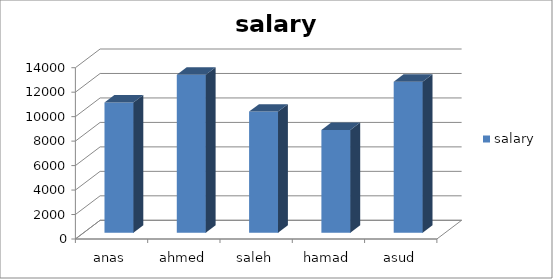
| Category | salary |
|---|---|
| anas | 10640 |
| ahmed | 12919.5 |
| saleh | 9900 |
| hamad | 8400 |
| asud | 12332.32 |